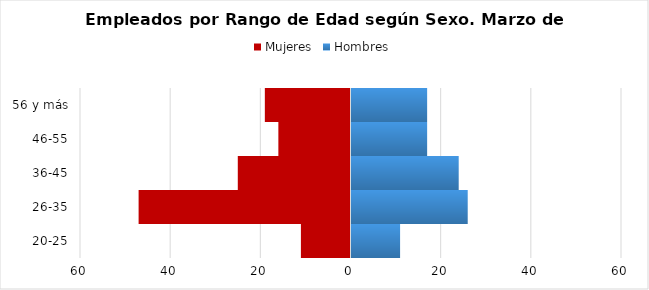
| Category | Mujeres | Hombres |
|---|---|---|
| 20-25 | -11 | 11 |
| 26-35 | -47 | 26 |
| 36-45 | -25 | 24 |
| 46-55 | -16 | 17 |
| 56 y más | -19 | 17 |